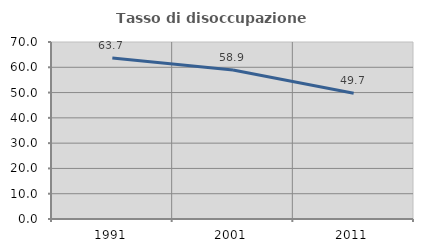
| Category | Tasso di disoccupazione giovanile  |
|---|---|
| 1991.0 | 63.66 |
| 2001.0 | 58.898 |
| 2011.0 | 49.693 |